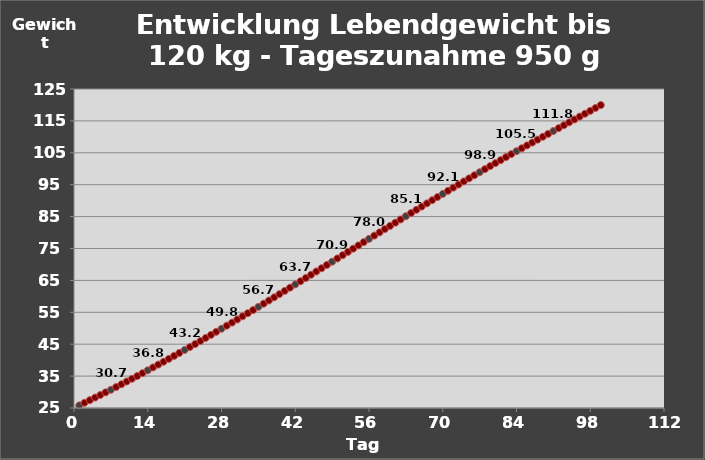
| Category | Series 1 |
|---|---|
| 0 | 25.817 |
| 1 | 26.634 |
| 2 | 27.451 |
| 3 | 28.268 |
| 4 | 29.085 |
| 5 | 29.902 |
| 6 | 30.719 |
| 7 | 31.579 |
| 8 | 32.439 |
| 9 | 33.299 |
| 10 | 34.159 |
| 11 | 35.019 |
| 12 | 35.916 |
| 13 | 36.813 |
| 14 | 37.71 |
| 15 | 38.607 |
| 16 | 39.504 |
| 17 | 40.401 |
| 18 | 41.331 |
| 19 | 42.261 |
| 20 | 43.191 |
| 21 | 44.121 |
| 22 | 45.051 |
| 23 | 46.009 |
| 24 | 46.967 |
| 25 | 47.925 |
| 26 | 48.883 |
| 27 | 49.841 |
| 28 | 50.799 |
| 29 | 51.78 |
| 30 | 52.761 |
| 31 | 53.742 |
| 32 | 54.723 |
| 33 | 55.704 |
| 34 | 56.703 |
| 35 | 57.702 |
| 36 | 58.701 |
| 37 | 59.7 |
| 38 | 60.699 |
| 39 | 61.711 |
| 40 | 62.723 |
| 41 | 63.735 |
| 42 | 64.747 |
| 43 | 65.759 |
| 44 | 66.779 |
| 45 | 67.799 |
| 46 | 68.819 |
| 47 | 69.839 |
| 48 | 70.859 |
| 49 | 71.882 |
| 50 | 72.905 |
| 51 | 73.928 |
| 52 | 74.951 |
| 53 | 75.974 |
| 54 | 76.995 |
| 55 | 78.016 |
| 56 | 79.037 |
| 57 | 80.058 |
| 58 | 81.072 |
| 59 | 82.086 |
| 60 | 83.1 |
| 61 | 84.114 |
| 62 | 85.128 |
| 63 | 86.13 |
| 64 | 87.132 |
| 65 | 88.134 |
| 66 | 89.136 |
| 67 | 90.138 |
| 68 | 91.123 |
| 69 | 92.108 |
| 70 | 93.093 |
| 71 | 94.078 |
| 72 | 95.063 |
| 73 | 96.025 |
| 74 | 96.987 |
| 75 | 97.949 |
| 76 | 98.911 |
| 77 | 99.873 |
| 78 | 100.835 |
| 79 | 101.77 |
| 80 | 102.705 |
| 81 | 103.64 |
| 82 | 104.575 |
| 83 | 105.51 |
| 84 | 106.413 |
| 85 | 107.316 |
| 86 | 108.219 |
| 87 | 109.122 |
| 88 | 110.025 |
| 89 | 110.928 |
| 90 | 111.831 |
| 91 | 112.734 |
| 92 | 113.637 |
| 93 | 114.54 |
| 94 | 115.443 |
| 95 | 116.346 |
| 96 | 117.249 |
| 97 | 118.152 |
| 98 | 119.055 |
| 99 | 119.958 |
| 100 | 0 |
| 101 | 0 |
| 102 | 0 |
| 103 | 0 |
| 104 | 0 |
| 105 | 0 |
| 106 | 0 |
| 107 | 0 |
| 108 | 0 |
| 109 | 0 |
| 110 | 0 |
| 111 | 0 |
| 112 | 0 |
| 113 | 0 |
| 114 | 0 |
| 115 | 0 |
| 116 | 0 |
| 117 | 0 |
| 118 | 0 |
| 119 | 0 |
| 120 | 0 |
| 121 | 0 |
| 122 | 0 |
| 123 | 0 |
| 124 | 0 |
| 125 | 0 |